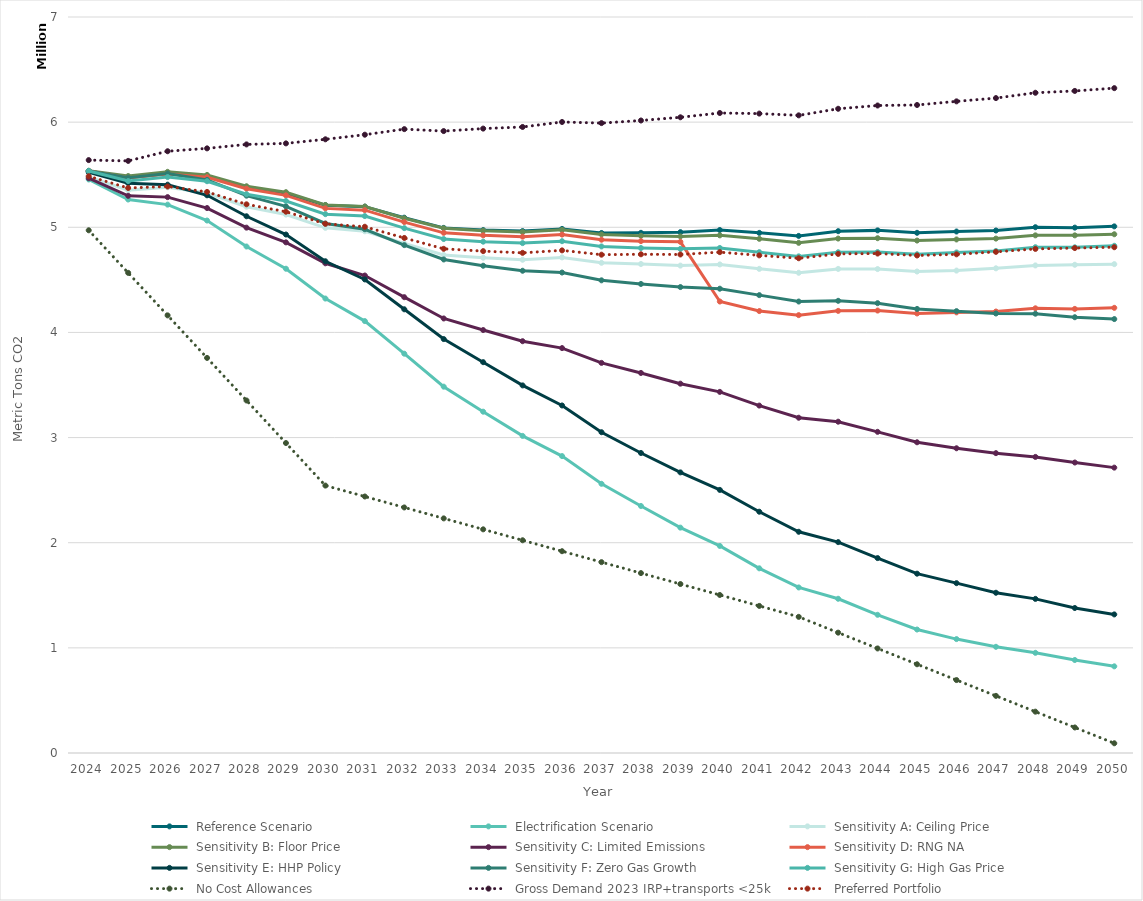
| Category | Series 0 | Series 1 | Series 2 | Series 3 | Series 4 | Series 5 | Series 6 | Series 7 | Series 8 | Series 9 | Series 10 | Series 11 |
|---|---|---|---|---|---|---|---|---|---|---|---|---|
| 2024.0 | 5535516.723 | 5454827.337 | 5478296.975 | 5537450.739 | 5466726.738 | 5535516.723 | 5523526.37 | 5536239.263 | 5535439.816 | 4971392.403 | 5639040.278 | 5485545.703 |
| 2025.0 | 5471919.544 | 5264165.59 | 5351893.273 | 5487572.892 | 5299182.444 | 5469457.969 | 5419206.633 | 5471919.545 | 5439735.128 | 4566744.184 | 5631456.37 | 5373671.1 |
| 2026.0 | 5511962.047 | 5215516.488 | 5380628.551 | 5527477.221 | 5286890.112 | 5507656.366 | 5405279.146 | 5511962.044 | 5477639.051 | 4162095.965 | 5723261.055 | 5387911.246 |
| 2027.0 | 5483091.973 | 5064241.956 | 5325589.726 | 5498047.999 | 5183043.879 | 5476469.321 | 5304216.943 | 5450311.823 | 5438078.472 | 3757447.747 | 5750626.188 | 5336414.894 |
| 2028.0 | 5384187.415 | 4817156.061 | 5195807.211 | 5390261.414 | 4996543.284 | 5366872.341 | 5104750.894 | 5300830.818 | 5314601.624 | 3352799.528 | 5788211.242 | 5218558.86 |
| 2029.0 | 5324081.945 | 4605920.642 | 5121030.768 | 5334102.518 | 4856667.461 | 5303630.412 | 4931190.017 | 5198511.701 | 5250085.582 | 2948151.309 | 5798021.116 | 5148163.945 |
| 2030.0 | 5210269.618 | 4322219.981 | 4994816.199 | 5212157.584 | 4657500.127 | 5179830.714 | 4676761.521 | 5036073.746 | 5124966.368 | 2543503.09 | 5836843.893 | 5033196.68 |
| 2031.0 | 5196362.68 | 4107836.923 | 4962255.018 | 5197123.587 | 4541235.438 | 5162881.88 | 4504069.006 | 4981398.877 | 5106652.389 | 2439450.691 | 5880558.017 | 5004958.017 |
| 2032.0 | 5091268.084 | 3797773.689 | 4846436.886 | 5085717.412 | 4335155.449 | 5049570.727 | 4219956.404 | 4830463.953 | 4991984.13 | 2335398.292 | 5933578.115 | 4898655.986 |
| 2033.0 | 4994330.084 | 3484140.916 | 4736292.226 | 4990460.335 | 4132824.7 | 4947197.747 | 3936890.05 | 4693957.024 | 4888262.625 | 2231345.893 | 5914995.346 | 4795260.834 |
| 2034.0 | 4973617.143 | 3246152.914 | 4710439.469 | 4967849.792 | 4022579.741 | 4923404.464 | 3717082.342 | 4634267.804 | 4863142.382 | 2127293.493 | 5938638.453 | 4773287.962 |
| 2035.0 | 4963785.053 | 3015868.033 | 4691302.287 | 4955737.753 | 3916401.679 | 4910982.05 | 3496134.492 | 4586588.587 | 4849440.212 | 2023241.094 | 5954073.221 | 4756893.726 |
| 2036.0 | 4984489.125 | 2823824.157 | 4713626.274 | 4975642.928 | 3851115.602 | 4930585.333 | 3305309.465 | 4569602.53 | 4867766.718 | 1919188.695 | 6001429.197 | 4780485.142 |
| 2037.0 | 4945861.626 | 2560429.905 | 4662257.058 | 4932515.877 | 3710303.73 | 4881859.307 | 3050990.873 | 4495577.69 | 4817713.088 | 1815136.296 | 5990979.443 | 4739442.774 |
| 2038.0 | 4947333.802 | 2349375.394 | 4650752.568 | 4919385.222 | 3614623.616 | 4868337.732 | 2853468.334 | 4461061.555 | 4802866.355 | 1711083.897 | 6015635.825 | 4743224.825 |
| 2039.0 | 4953668.92 | 2143507.789 | 4635599.787 | 4913144.394 | 3512648.841 | 4861714.623 | 2668966.104 | 4431560.499 | 4794869.067 | 1607031.498 | 6046108.24 | 4741317.888 |
| 2040.0 | 4974135.698 | 1969407.442 | 4646760.906 | 4923220.646 | 3434465.037 | 4293956.61 | 2502273.385 | 4415807.669 | 4803208.961 | 1502979.099 | 6086955.841 | 4763517.072 |
| 2041.0 | 4947029.154 | 1756495.018 | 4604592.726 | 4890439.736 | 3304351.752 | 4203126.323 | 2294736.449 | 4354799.41 | 4763455.526 | 1398926.699 | 6081405.563 | 4732840.721 |
| 2042.0 | 4918070.366 | 1574511.192 | 4567381.91 | 4852055.353 | 3188609.152 | 4164532.196 | 2103955.055 | 4293800.779 | 4723391.262 | 1294874.3 | 6064545.47 | 4705509.346 |
| 2043.0 | 4962976.283 | 1466843.775 | 4604001.684 | 4892741.426 | 3151018.13 | 4205007.31 | 2005642.778 | 4300627.786 | 4762398.817 | 1144576.39 | 6127186.776 | 4746792.958 |
| 2044.0 | 4970609.585 | 1314486.581 | 4602656.08 | 4896051.282 | 3054599.21 | 4208085.763 | 1853749.166 | 4278249.747 | 4763966.165 | 994278.481 | 6158252.768 | 4750226.486 |
| 2045.0 | 4947514.789 | 1174335.479 | 4579370.768 | 4873763.616 | 2955242.089 | 4180375.416 | 1705469.366 | 4223612.877 | 4743551.62 | 843980.571 | 6163122.634 | 4731803.938 |
| 2046.0 | 4959818.347 | 1083349.647 | 4588140.918 | 4884227.782 | 2898344.536 | 4190690.418 | 1615339.871 | 4202562.794 | 4760427.486 | 693682.661 | 6197699.921 | 4742795.068 |
| 2047.0 | 4969480.413 | 1009944.833 | 4609671.526 | 4892366.141 | 2851942.897 | 4198686.159 | 1524175.392 | 4180122.597 | 4774301.648 | 543384.751 | 6228837.459 | 4766211.39 |
| 2048.0 | 5000646.611 | 952803.358 | 4637160.37 | 4923240.93 | 2816092.172 | 4229428.084 | 1465856.514 | 4178072.273 | 4810397.032 | 393086.841 | 6279465.407 | 4794332.753 |
| 2049.0 | 4996752.915 | 884374.125 | 4643473.053 | 4923168.644 | 2762723.488 | 4223804.39 | 1378966.295 | 4144636.136 | 4809549.363 | 242788.931 | 6296833.904 | 4802565.902 |
| 2050.0 | 5008726.26 | 824143.442 | 4649338.576 | 4933769.5 | 2714110.53 | 4233939.863 | 1318023.28 | 4127024.587 | 4823988.42 | 92491.021 | 6323367.955 | 4810444.468 |